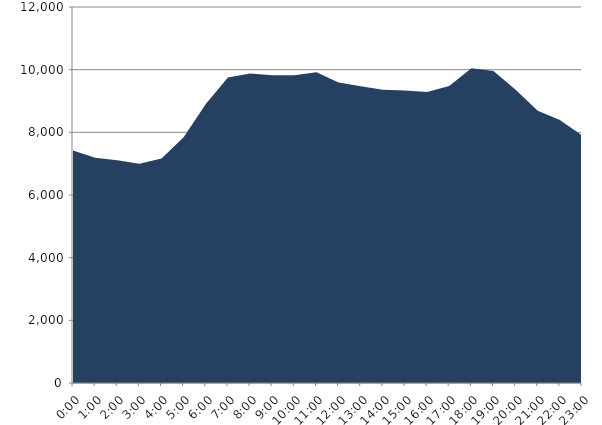
| Category | Series 0 | Series 1 |
|---|---|---|
| 2019-03-20 |  | 7417.32 |
| 2019-03-20 01:00:00 |  | 7185.19 |
| 2019-03-20 02:00:00 |  | 7105.18 |
| 2019-03-20 03:00:00 |  | 7000.88 |
| 2019-03-20 04:00:00 |  | 7166.83 |
| 2019-03-20 05:00:00 |  | 7843.23 |
| 2019-03-20 06:00:00 |  | 8906.71 |
| 2019-03-20 07:00:00 |  | 9749.52 |
| 2019-03-20 08:00:00 |  | 9878.67 |
| 2019-03-20 09:00:00 |  | 9818.04 |
| 2019-03-20 10:00:00 |  | 9818.14 |
| 2019-03-20 11:00:00 |  | 9919.44 |
| 2019-03-20 12:00:00 |  | 9588.16 |
| 2019-03-20 13:00:00 |  | 9474.11 |
| 2019-03-20 14:00:00 |  | 9357.32 |
| 2019-03-20 15:00:00 |  | 9331.56 |
| 2019-03-20 16:00:00 |  | 9284.72 |
| 2019-03-20 17:00:00 |  | 9477.8 |
| 2019-03-20 18:00:00 |  | 10044.67 |
| 2019-03-20 19:00:00 |  | 9955.7 |
| 2019-03-20 20:00:00 |  | 9356.3 |
| 2019-03-20 21:00:00 |  | 8688.12 |
| 2019-03-20 22:00:00 |  | 8393.02 |
| 2019-03-20 23:00:00 |  | 7902.46 |